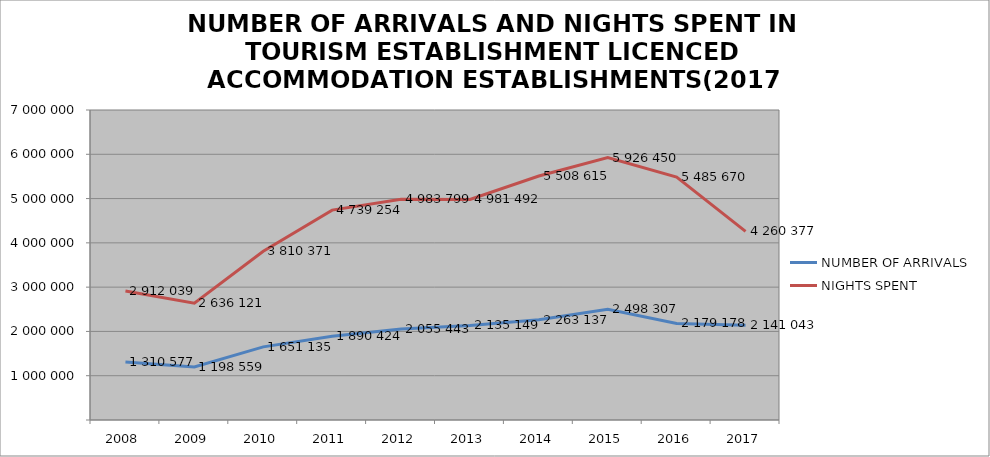
| Category | NUMBER OF ARRIVALS | NIGHTS SPENT |
|---|---|---|
| 2008 | 1310577 | 2912039 |
| 2009 | 1198559 | 2636121 |
| 2010 | 1651135 | 3810371 |
| 2011 | 1890424 | 4739254 |
| 2012 | 2055443 | 4983799 |
| 2013 | 2135149 | 4981492 |
| 2014 | 2263137 | 5508615 |
| 2015 | 2498307 | 5926450 |
| 2016 | 2179178 | 5485670 |
| 2017 | 2141043 | 4260377 |